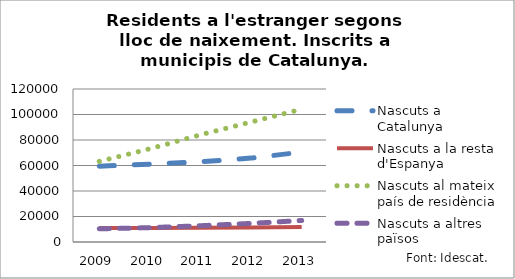
| Category | Nascuts a Catalunya | Nascuts a la resta d'Espanya  | Nascuts al mateix país de residència | Nascuts a altres països  |
|---|---|---|---|---|
| 2009.0 | 59463 | 10997 | 63210 | 10332 |
| 2010.0 | 61035 | 10991 | 73121 | 11253 |
| 2011.0 | 62925 | 11120 | 84093 | 12771 |
| 2012.0 | 65791 | 11358 | 94111 | 14588 |
| 2013.0 | 70535 | 11685 | 104158 | 16872 |